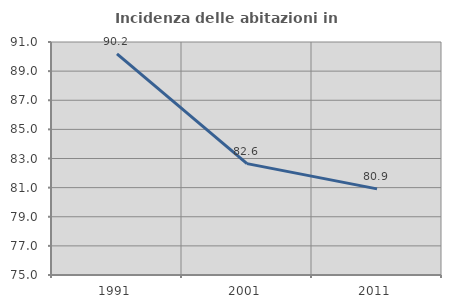
| Category | Incidenza delle abitazioni in proprietà  |
|---|---|
| 1991.0 | 90.179 |
| 2001.0 | 82.648 |
| 2011.0 | 80.916 |